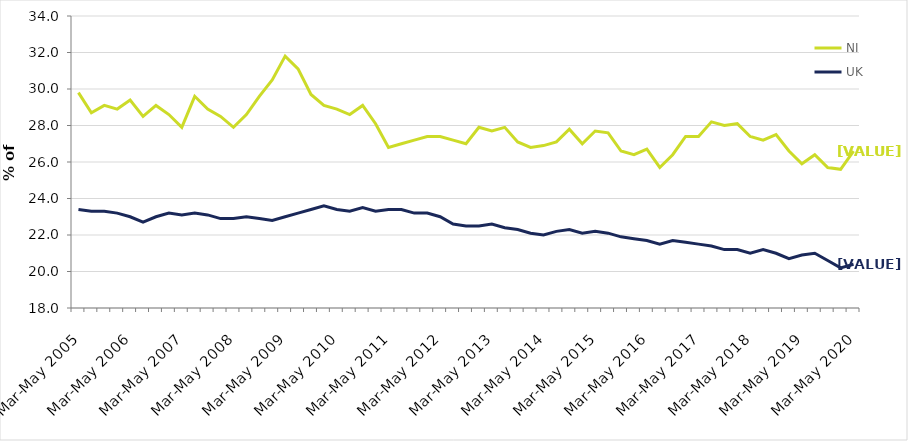
| Category | NI | UK |
|---|---|---|
| Mar-May 2005 | 29.8 | 23.4 |
| Jun-Aug 2005 | 28.7 | 23.3 |
| Sep-Nov 2005 | 29.1 | 23.3 |
| Dec-Feb 2006 | 28.9 | 23.2 |
| Mar-May 2006 | 29.4 | 23 |
| Jun-Aug 2006 | 28.5 | 22.7 |
| Sep-Nov 2006 | 29.1 | 23 |
| Dec-Feb 2007 | 28.6 | 23.2 |
| Mar-May 2007 | 27.9 | 23.1 |
| Jun-Aug 2007 | 29.6 | 23.2 |
| Sep-Nov 2007 | 28.9 | 23.1 |
| Dec-Feb 2008 | 28.5 | 22.9 |
| Mar-May 2008 | 27.9 | 22.9 |
| Jun-Aug 2008 | 28.6 | 23 |
| Sep-Nov 2008 | 29.6 | 22.9 |
| Dec-Feb 2009 | 30.5 | 22.8 |
| Mar-May 2009 | 31.8 | 23 |
| Jun-Aug 2009 | 31.1 | 23.2 |
| Sep-Nov 2009 | 29.7 | 23.4 |
| Dec-Feb 2010 | 29.1 | 23.6 |
| Mar-May 2010 | 28.9 | 23.4 |
| Jun-Aug 2010 | 28.6 | 23.3 |
| Sep-Nov 2010 | 29.1 | 23.5 |
| Dec-Feb 2011 | 28.1 | 23.3 |
| Mar-May 2011 | 26.8 | 23.4 |
| Jun-Aug 2011 | 27 | 23.4 |
| Sep-Nov 2011 | 27.2 | 23.2 |
| Dec-Feb 2012 | 27.4 | 23.2 |
| Mar-May 2012 | 27.4 | 23 |
| Jun-Aug 2012 | 27.2 | 22.6 |
| Sep-Nov 2012 | 27 | 22.5 |
| Dec-Feb 2013 | 27.9 | 22.5 |
| Mar-May 2013 | 27.7 | 22.6 |
| Jun-Aug 2013 | 27.9 | 22.4 |
| Sep-Nov 2013 | 27.1 | 22.3 |
| Dec-Feb 2014 | 26.8 | 22.1 |
| Mar-May 2014 | 26.9 | 22 |
| Jun-Aug 2014 | 27.1 | 22.2 |
| Sep-Nov 2014 | 27.8 | 22.3 |
| Dec-Feb 2015 | 27 | 22.1 |
| Mar-May 2015 | 27.7 | 22.2 |
| Jun-Aug 2015 | 27.6 | 22.1 |
| Sep-Nov 2015 | 26.6 | 21.9 |
| Dec-Feb 2016 | 26.4 | 21.8 |
| Mar-May 2016 | 26.7 | 21.7 |
| Jun-Aug 2016 | 25.7 | 21.5 |
| Sep-Nov 2016 | 26.4 | 21.7 |
| Dec-Feb 2017 | 27.4 | 21.6 |
| Mar-May 2017 | 27.4 | 21.5 |
| Jun-Aug 2017 | 28.2 | 21.4 |
| Sep-Nov 2017 | 28 | 21.2 |
| Dec-Feb 2018 | 28.1 | 21.2 |
| Mar-May 2018 | 27.4 | 21 |
| Jun-Aug 2018 | 27.2 | 21.2 |
| Sep-Nov 2018 | 27.5 | 21 |
| Dec-Feb 2019 | 26.6 | 20.7 |
| Mar-May 2019 | 25.9 | 20.9 |
| Jun-Aug 2019 | 26.4 | 21 |
| Sep-Nov 2019 | 25.7 | 20.6 |
| Dec-Feb 2020 | 25.6 | 20.2 |
| Mar-May 2020 | 26.6 | 20.4 |